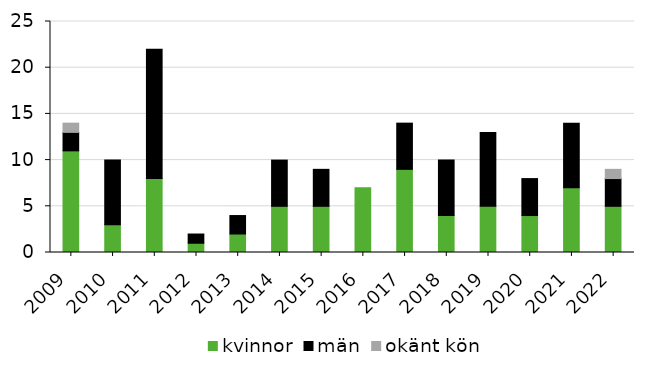
| Category | kvinnor | män | okänt kön |
|---|---|---|---|
| 2009 | 11 | 2 | 1 |
| 2010 | 3 | 7 | 0 |
| 2011 | 8 | 14 | 0 |
| 2012 | 1 | 1 | 0 |
| 2013 | 2 | 2 | 0 |
| 2014 | 5 | 5 | 0 |
| 2015 | 5 | 4 | 0 |
| 2016 | 7 | 0 | 0 |
| 2017 | 9 | 5 | 0 |
| 2018 | 4 | 6 | 0 |
| 2019 | 5 | 8 | 0 |
| 2020 | 4 | 4 | 0 |
| 2021 | 7 | 7 | 0 |
| 2022 | 5 | 3 | 1 |